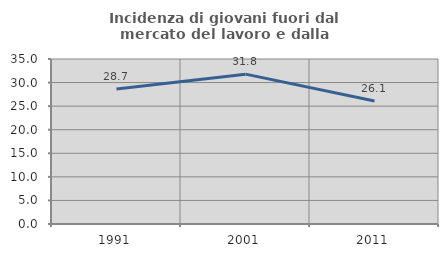
| Category | Incidenza di giovani fuori dal mercato del lavoro e dalla formazione  |
|---|---|
| 1991.0 | 28.657 |
| 2001.0 | 31.79 |
| 2011.0 | 26.093 |